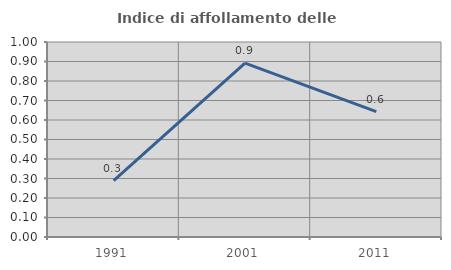
| Category | Indice di affollamento delle abitazioni  |
|---|---|
| 1991.0 | 0.289 |
| 2001.0 | 0.892 |
| 2011.0 | 0.643 |